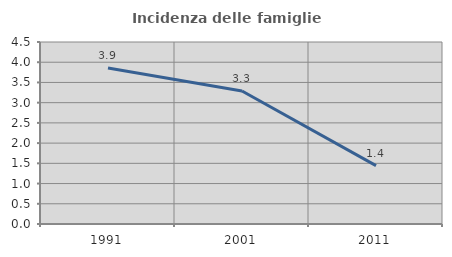
| Category | Incidenza delle famiglie numerose |
|---|---|
| 1991.0 | 3.858 |
| 2001.0 | 3.289 |
| 2011.0 | 1.442 |